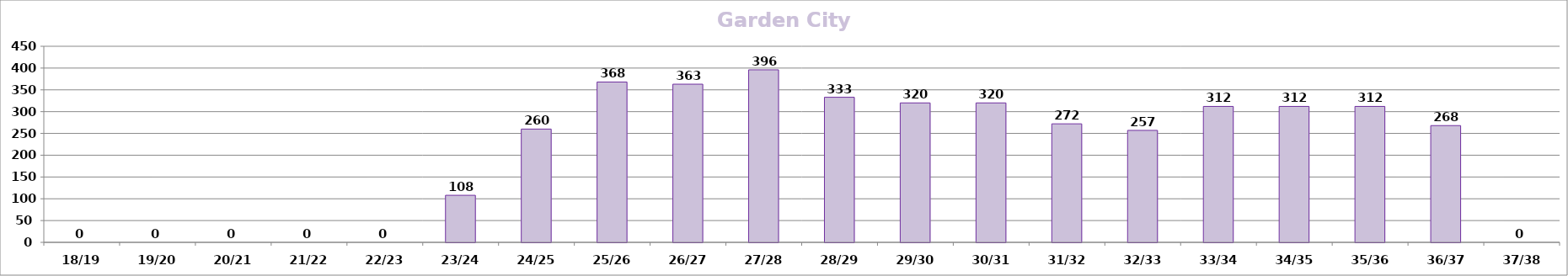
| Category | Garden City Suburb |
|---|---|
| 18/19 | 0 |
| 19/20 | 0 |
| 20/21 | 0 |
| 21/22 | 0 |
| 22/23 | 0 |
| 23/24 | 108 |
| 24/25 | 260 |
| 25/26 | 368 |
| 26/27 | 363 |
| 27/28 | 396 |
| 28/29 | 333 |
| 29/30 | 320 |
| 30/31 | 320 |
| 31/32 | 272 |
| 32/33 | 257 |
| 33/34 | 312 |
| 34/35 | 312 |
| 35/36 | 312 |
| 36/37 | 268 |
| 37/38 | 0 |